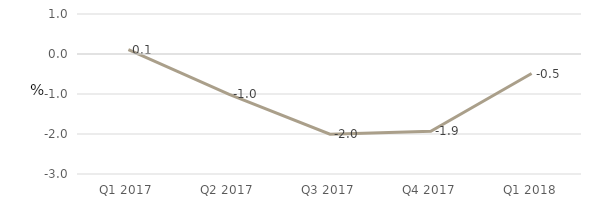
| Category | Non-Financial  |
|---|---|
| Q1 2017 | 0.106 |
| Q2 2017 | -1.01 |
| Q3 2017 | -2.004 |
| Q4 2017 | -1.933 |
| Q1 2018 | -0.488 |